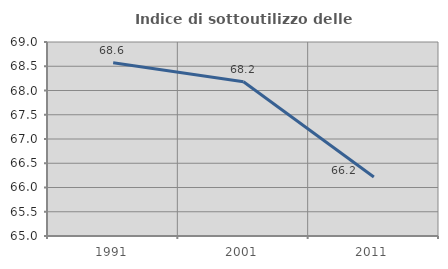
| Category | Indice di sottoutilizzo delle abitazioni  |
|---|---|
| 1991.0 | 68.571 |
| 2001.0 | 68.182 |
| 2011.0 | 66.216 |